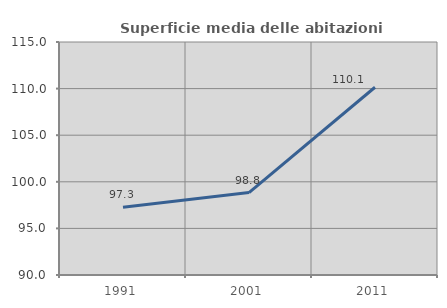
| Category | Superficie media delle abitazioni occupate |
|---|---|
| 1991.0 | 97.267 |
| 2001.0 | 98.841 |
| 2011.0 | 110.145 |